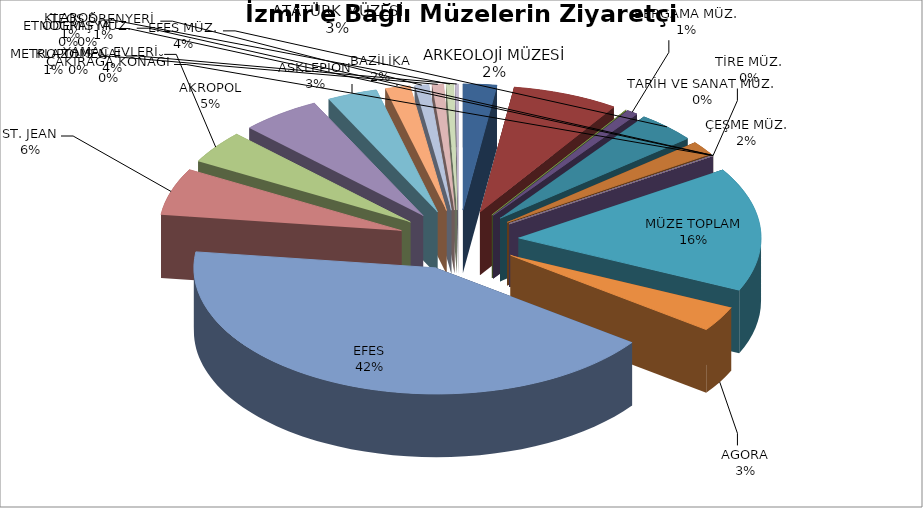
| Category | Series 0 |
|---|---|
| ARKEOLOJİ MÜZESİ | 11743 |
| ATATÜRK MÜZESİ | 36943 |
| TARİH VE SANAT MÜZ. | 194 |
| BERGAMA MÜZ. | 3974 |
| EFES MÜZ. | 20771 |
| ÇEŞME MÜZ. | 9240 |
| ÖDEMİŞ MÜZ. | 314 |
| TİRE MÜZ. | 0 |
| ÇAKIRAĞA KONAĞI | 0 |
| ETNOGRAFYA | 0 |
| MÜZE TOPLAM | 83179 |
| AGORA | 16979 |
| EFES | 219624 |
| ST. JEAN | 31437 |
| YAMAÇ EVLERİ | 22206 |
| AKROPOL | 27787 |
| ASKLEPİON | 17498 |
| BAZİLİKA | 8630 |
| TEOS ÖRENYERİ | 4842 |
| METROPOLİS | 4008 |
| KLAROS | 2661 |
| KLAZOMENAİ | 1083 |